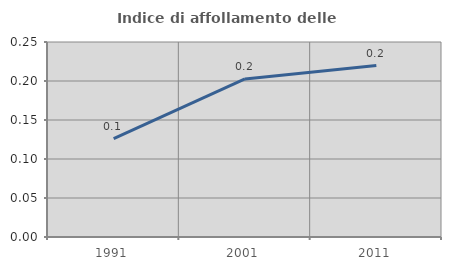
| Category | Indice di affollamento delle abitazioni  |
|---|---|
| 1991.0 | 0.126 |
| 2001.0 | 0.203 |
| 2011.0 | 0.22 |